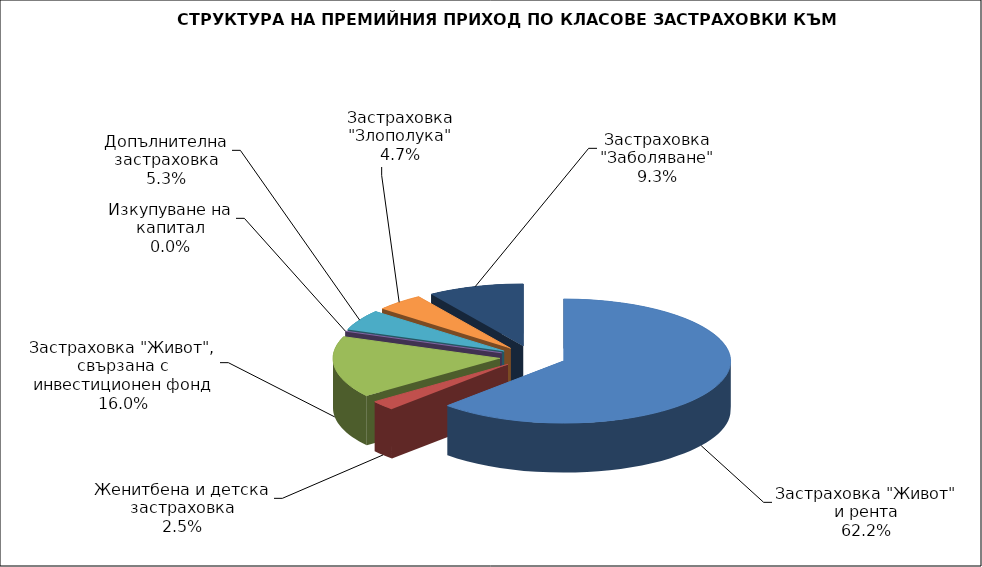
| Category | Series 0 |
|---|---|
| Застраховка "Живот" и рента | 50241930.831 |
| Женитбена и детска застраховка | 1996800.615 |
| Застраховка "Живот", свързана с инвестиционен фонд | 12922190.089 |
| Изкупуване на капитал | 0 |
| Допълнителна застраховка | 4297194.55 |
| Застраховка "Злополука" | 3781317.8 |
| Застраховка "Заболяване" | 7505019.3 |